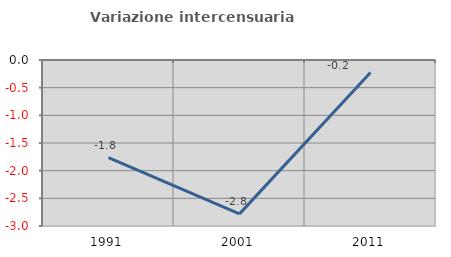
| Category | Variazione intercensuaria annua |
|---|---|
| 1991.0 | -1.765 |
| 2001.0 | -2.781 |
| 2011.0 | -0.227 |